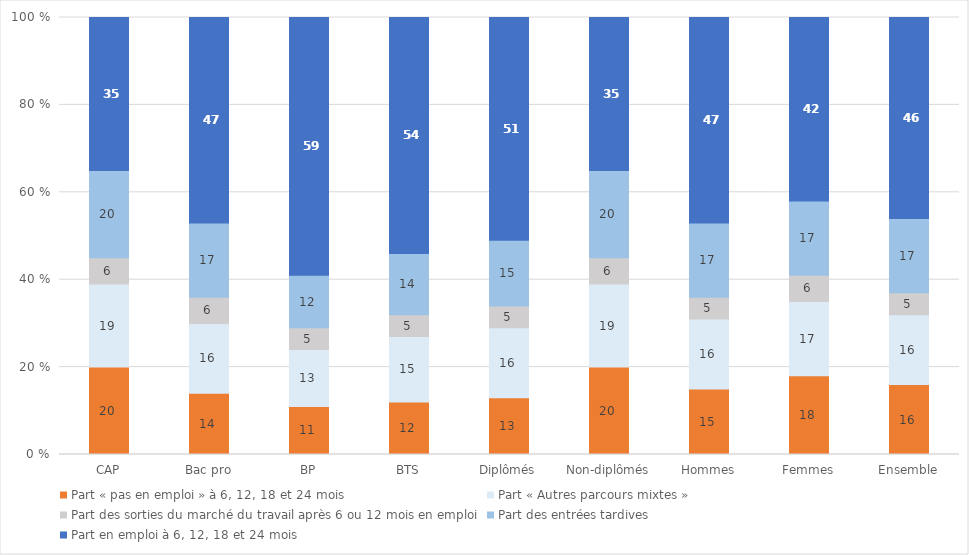
| Category | Part « pas en emploi » à 6, 12, 18 et 24 mois | Part « Autres parcours mixtes » | Part des sorties du marché du travail après 6 ou 12 mois en emploi | Part des entrées tardives | Part en emploi à 6, 12, 18 et 24 mois |
|---|---|---|---|---|---|
| CAP | 20 | 19 | 6 | 20 | 35 |
| Bac pro | 14 | 16 | 6 | 17 | 47 |
| BP | 11 | 13 | 5 | 12 | 59 |
| BTS | 12 | 15 | 5 | 14 | 54 |
| Diplômés | 13 | 16 | 5 | 15 | 51 |
| Non-diplômés | 20 | 19 | 6 | 20 | 35 |
| Hommes | 15 | 16 | 5 | 17 | 47 |
| Femmes | 18 | 17 | 6 | 17 | 42 |
| Ensemble | 16 | 16 | 5 | 17 | 46 |